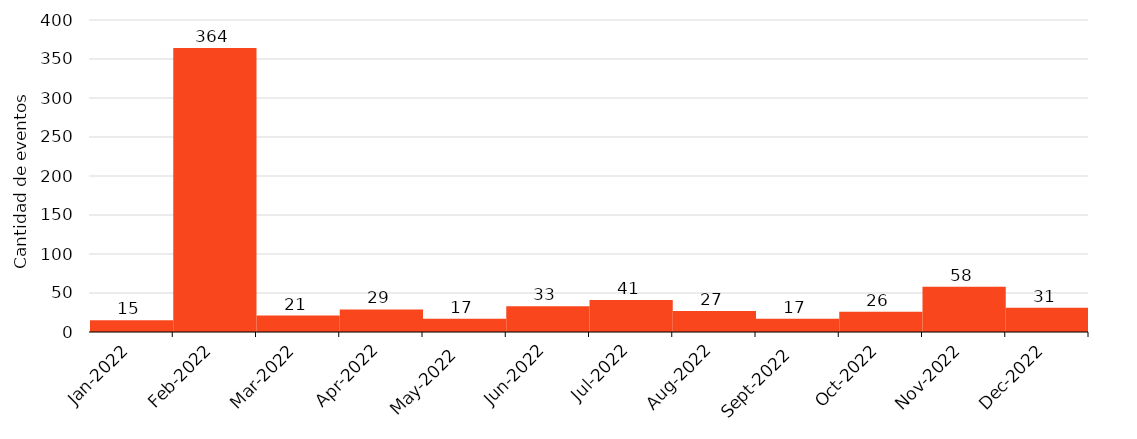
| Category | Falla No Envío de Lectura |
|---|---|
| 2022-01-01 | 15 |
| 2022-02-01 | 364 |
| 2022-03-01 | 21 |
| 2022-04-01 | 29 |
| 2022-05-01 | 17 |
| 2022-06-01 | 33 |
| 2022-07-01 | 41 |
| 2022-08-01 | 27 |
| 2022-09-01 | 17 |
| 2022-10-01 | 26 |
| 2022-11-01 | 58 |
| 2022-12-01 | 31 |